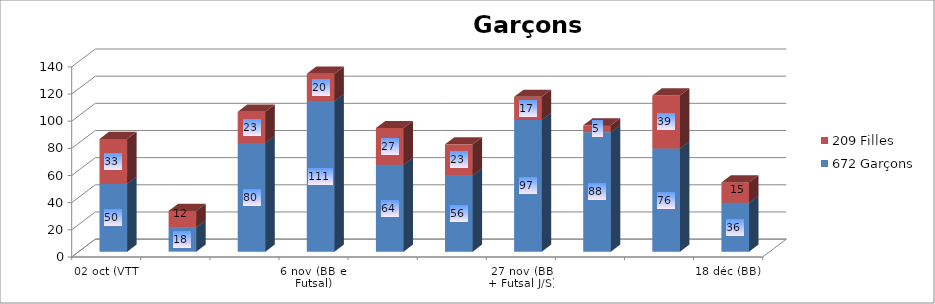
| Category | 672 Garçons | 209 Filles |
|---|---|---|
| 02 oct (VTT) | 50 | 33 |
| 09 oct (Badminton et Rugby) | 18 | 12 |
| 16 oct (VB et Foot à 7) | 80 | 23 |
| 6 nov (BB et Futsal) | 111 | 20 |
| 13 nov (RAID URBAIN et VB) | 64 | 27 |
| 20 nov (Bad + Choré coll + Futsal J/S) | 56 | 23 |
| 27 nov (BB + Futsal J/S) | 97 | 17 |
| 04 déc (BB interdistrict+ Futsal Cadets + Futsal Filles) | 88 | 5 |
| 11 déc (Futsal J/S + Bad) | 76 | 39 |
| 18 déc (BB) | 36 | 15 |